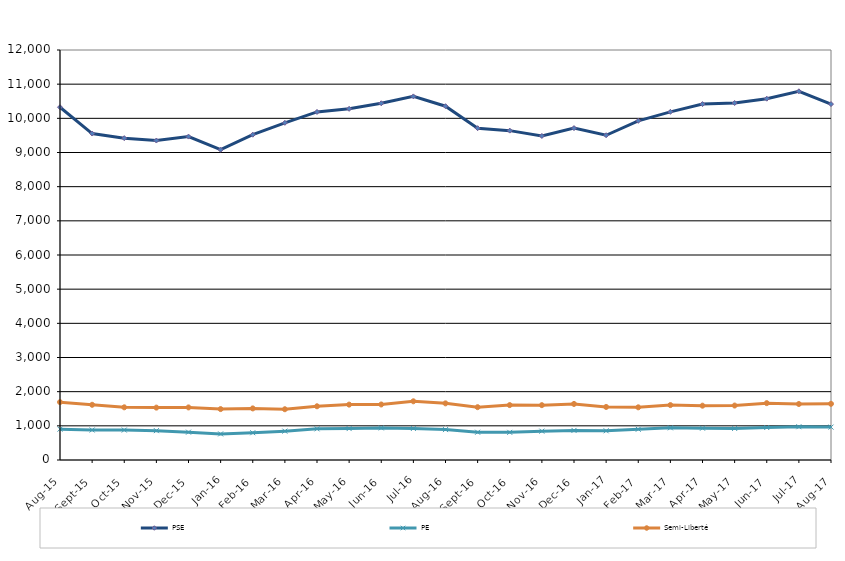
| Category | PSE | PE | Semi-Liberté |
|---|---|---|---|
| 2015-08-01 | 10325 | 903 | 1694 |
| 2015-09-01 | 9555 | 878 | 1616 |
| 2015-10-01 | 9420 | 877 | 1542 |
| 2015-11-01 | 9350 | 859 | 1533 |
| 2015-12-01 | 9466 | 815 | 1539 |
| 2016-01-01 | 9081 | 764 | 1490 |
| 2016-02-01 | 9521 | 798 | 1510 |
| 2016-03-01 | 9868 | 845 | 1486 |
| 2016-04-01 | 10187 | 912 | 1572 |
| 2016-05-01 | 10278 | 920 | 1621 |
| 2016-06-01 | 10441 | 939 | 1625 |
| 2016-07-01 | 10642 | 923 | 1718 |
| 2016-08-01 | 10355 | 890 | 1658 |
| 2016-09-01 | 9712 | 813 | 1546 |
| 2016-10-01 | 9640 | 809 | 1607 |
| 2016-11-01 | 9484 | 844 | 1605 |
| 2016-12-01 | 9714 | 866 | 1641 |
| 2017-01-01 | 9505 | 855 | 1553 |
| 2017-02-01 | 9927 | 900 | 1542 |
| 2017-03-01 | 10190 | 942 | 1607 |
| 2017-04-01 | 10417 | 931 | 1590 |
| 2017-05-01 | 10448 | 924 | 1594 |
| 2017-06-01 | 10575 | 951 | 1664 |
| 2017-07-01 | 10791 | 974 | 1639 |
| 2017-08-01 | 10417 | 963 | 1644 |